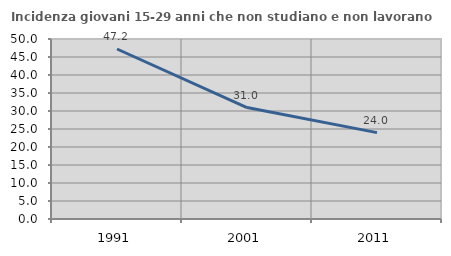
| Category | Incidenza giovani 15-29 anni che non studiano e non lavorano  |
|---|---|
| 1991.0 | 47.222 |
| 2001.0 | 30.952 |
| 2011.0 | 24 |